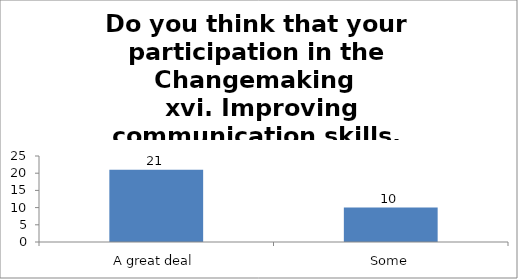
| Category | Do you think that your participation in the Changemaking 
 xvi. Improving communication skills. |
|---|---|
| A great deal | 21 |
| Some | 10 |